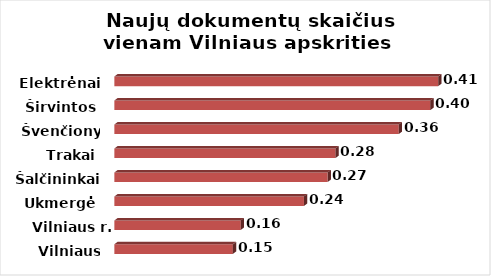
| Category | Series 0 |
|---|---|
| Vilniaus m. | 0.15 |
| Vilniaus r. | 0.16 |
| Ukmergė | 0.24 |
| Šalčininkai | 0.27 |
| Trakai | 0.28 |
| Švenčionys | 0.36 |
| Širvintos | 0.4 |
| Elektrėnai | 0.41 |